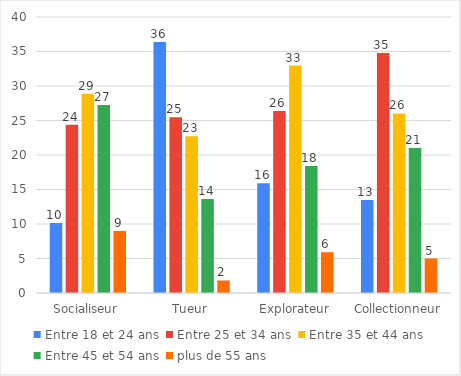
| Category | Entre 18 et 24 ans | Entre 25 et 34 ans | Entre 35 et 44 ans | Entre 45 et 54 ans | plus de 55 ans |
|---|---|---|---|---|---|
| Socialiseur | 10.163 | 24.39 | 28.862 | 27.236 | 9 |
| Tueur | 36.364 | 25.455 | 22.727 | 13.636 | 1.818 |
| Explorateur | 15.909 | 26.364 | 32.955 | 18.409 | 5.909 |
| Collectionneur | 13.48 | 34.796 | 26.019 | 21.003 | 5 |